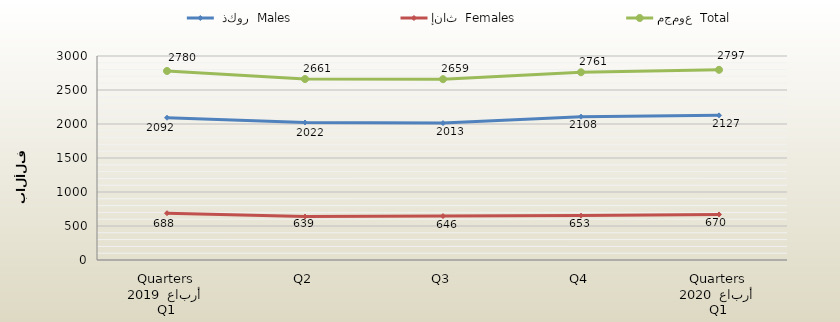
| Category |  ذكور  Males | إناث  Females | مجموع  Total |
|---|---|---|---|
| 0 | 2092 | 688 | 2780 |
| 1 | 2022 | 639 | 2661 |
| 2 | 2013 | 646 | 2659 |
| 3 | 2108 | 653 | 2761 |
| 4 | 2127 | 670 | 2797 |